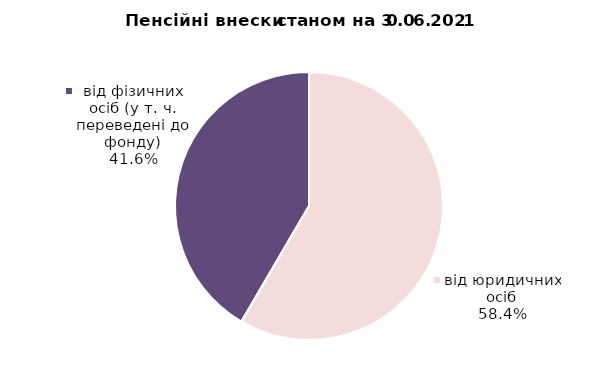
| Category | Series 0 |
|---|---|
| від юридичних осіб | 867.316 |
| від ФОПів | 0.276 |
| від фізичних осіб (у т. ч. переведені до фонду) | 617.369 |